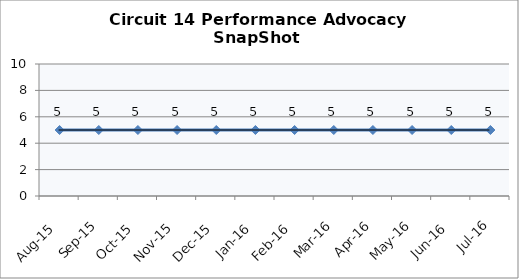
| Category | Circuit 14 |
|---|---|
| Aug-15 | 5 |
| Sep-15 | 5 |
| Oct-15 | 5 |
| Nov-15 | 5 |
| Dec-15 | 5 |
| Jan-16 | 5 |
| Feb-16 | 5 |
| Mar-16 | 5 |
| Apr-16 | 5 |
| May-16 | 5 |
| Jun-16 | 5 |
| Jul-16 | 5 |